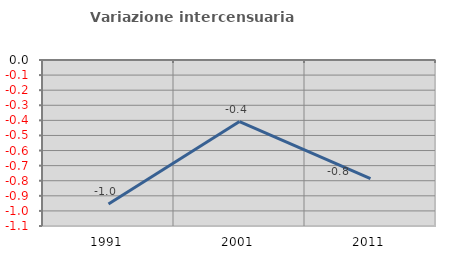
| Category | Variazione intercensuaria annua |
|---|---|
| 1991.0 | -0.954 |
| 2001.0 | -0.408 |
| 2011.0 | -0.785 |